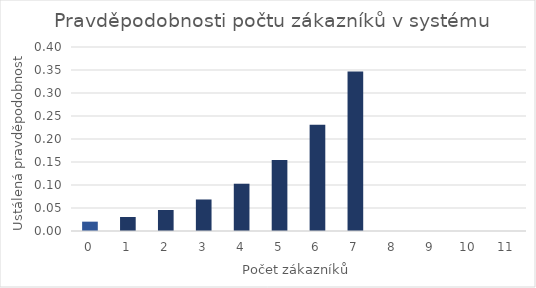
| Category |  pk=p0*qk |
|---|---|
| 0.0 | 0.02 |
| 1.0 | 0.03 |
| 2.0 | 0.046 |
| 3.0 | 0.069 |
| 4.0 | 0.103 |
| 5.0 | 0.154 |
| 6.0 | 0.231 |
| 7.0 | 0.347 |
| 8.0 | 0 |
| 9.0 | 0 |
| 10.0 | 0 |
| 11.0 | 0 |